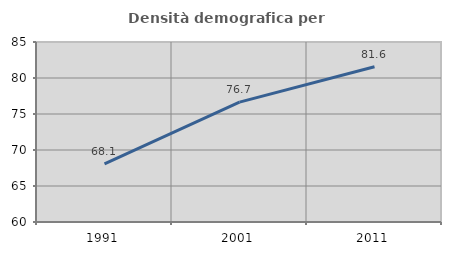
| Category | Densità demografica |
|---|---|
| 1991.0 | 68.06 |
| 2001.0 | 76.654 |
| 2011.0 | 81.554 |